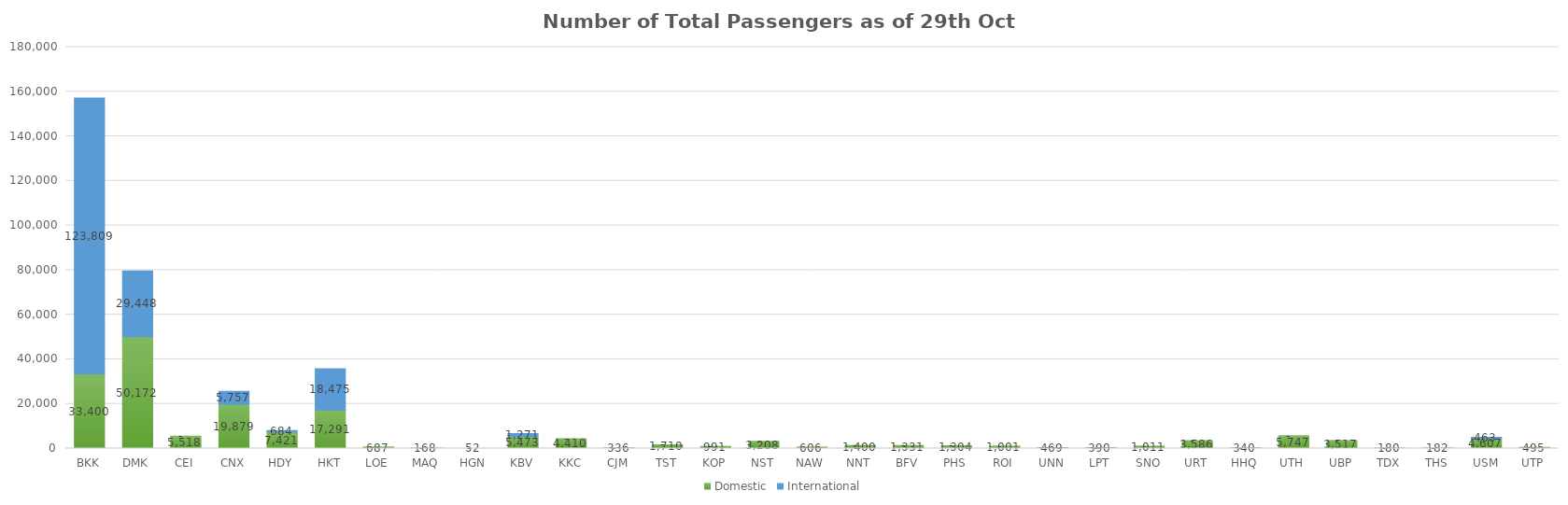
| Category | Domestic | International |
|---|---|---|
| BKK | 33400 | 123809 |
| DMK | 50172 | 29448 |
| CEI | 5518 | 0 |
| CNX | 19879 | 5757 |
| HDY | 7421 | 684 |
| HKT | 17291 | 18475 |
| LOE | 687 | 0 |
| MAQ | 168 | 0 |
| HGN | 52 | 0 |
| KBV | 5473 | 1271 |
| KKC | 4410 | 0 |
| CJM | 336 | 0 |
| TST | 1710 | 0 |
| KOP | 991 | 0 |
| NST | 3208 | 0 |
| NAW | 606 | 0 |
| NNT | 1400 | 0 |
| BFV | 1331 | 0 |
| PHS | 1304 | 0 |
| ROI | 1001 | 0 |
| UNN | 469 | 0 |
| LPT | 390 | 0 |
| SNO | 1011 | 0 |
| URT | 3586 | 0 |
| HHQ | 340 | 0 |
| UTH | 5747 | 0 |
| UBP | 3517 | 0 |
| TDX | 180 | 0 |
| THS | 182 | 0 |
| USM | 4607 | 463 |
| UTP | 495 | 0 |